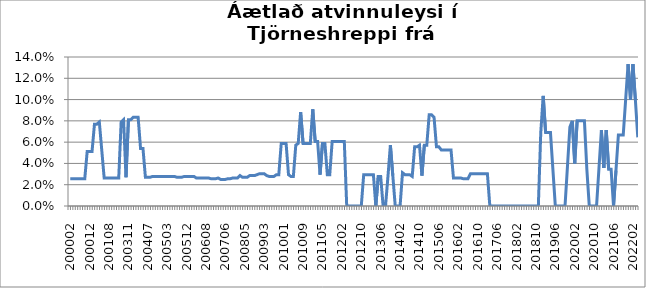
| Category | Series 0 |
|---|---|
| 200002 | 0.026 |
| 200003 | 0.026 |
| 200004 | 0.026 |
| 200005 | 0.026 |
| 200008 | 0.026 |
| 200009 | 0.026 |
| 200010 | 0.026 |
| 200011 | 0.051 |
| 200012 | 0.051 |
| 200101 | 0.051 |
| 200102 | 0.077 |
| 200103 | 0.077 |
| 200104 | 0.079 |
| 200105 | 0.053 |
| 200106 | 0.026 |
| 200107 | 0.026 |
| 200108 | 0.026 |
| 200110 | 0.026 |
| 200111 | 0.026 |
| 200201 | 0.026 |
| 200202 | 0.026 |
| 200302 | 0.079 |
| 200303 | 0.081 |
| 200307 | 0.027 |
| 200311 | 0.081 |
| 200312 | 0.081 |
| 200401 | 0.083 |
| 200402 | 0.083 |
| 200403 | 0.083 |
| 200404 | 0.054 |
| 200405 | 0.054 |
| 200406 | 0.027 |
| 200407 | 0.027 |
| 200408 | 0.027 |
| 200409 | 0.028 |
| 200410 | 0.028 |
| 200411 | 0.028 |
| 200412 | 0.028 |
| 200501 | 0.028 |
| 200502 | 0.028 |
| 200503 | 0.028 |
| 200504 | 0.028 |
| 200505 | 0.028 |
| 200506 | 0.028 |
| 200507 | 0.027 |
| 200508 | 0.027 |
| 200509 | 0.027 |
| 200510 | 0.028 |
| 200512 | 0.028 |
| 200601 | 0.028 |
| 200602 | 0.028 |
| 200603 | 0.028 |
| 200604 | 0.026 |
| 200605 | 0.026 |
| 200606 | 0.026 |
| 200607 | 0.026 |
| 200608 | 0.026 |
| 200609 | 0.026 |
| 200610 | 0.026 |
| 200611 | 0.026 |
| 200612 | 0.026 |
| 200703 | 0.026 |
| 200704 | 0.025 |
| 200705 | 0.025 |
| 200706 | 0.025 |
| 200707 | 0.026 |
| 200709 | 0.026 |
| 200710 | 0.026 |
| 200711 | 0.026 |
| 200801 | 0.026 |
| 200803 | 0.029 |
| 200804 | 0.027 |
| 200805 | 0.027 |
| 200806 | 0.027 |
| 200807 | 0.029 |
| 200808 | 0.029 |
| 200809 | 0.029 |
| 200810 | 0.029 |
| 200901 | 0.03 |
| 200902 | 0.03 |
| 200903 | 0.03 |
| 200905 | 0.029 |
| 200907 | 0.028 |
| 200908 | 0.028 |
| 200909 | 0.028 |
| 200910 | 0.029 |
| 200911 | 0.029 |
| 200912 | 0.059 |
| 201001 | 0.059 |
| 201002 | 0.059 |
| 201003 | 0.029 |
| 201004 | 0.028 |
| 201005 | 0.028 |
| 201006 | 0.057 |
| 201007 | 0.059 |
| 201008 | 0.088 |
| 201009 | 0.059 |
| 201010 | 0.059 |
| 201011 | 0.059 |
| 201012 | 0.059 |
| 201101 | 0.091 |
| 201102 | 0.061 |
| 201103 | 0.061 |
| 201104 | 0.029 |
| 201105 | 0.059 |
| 201106 | 0.059 |
| 201107 | 0.029 |
| 201108 | 0.029 |
| 201110 | 0.061 |
| 201111 | 0.061 |
| 201112 | 0.061 |
| 201201 | 0.061 |
| 201202 | 0.061 |
| 201203 | 0.061 |
| 201204 | 0 |
| 201205 | 0 |
| 201206 | 0 |
| 201207 | 0 |
| 201208 | 0 |
| 201209 | 0 |
| 201210 | 0 |
| 201211 | 0.029 |
| 201212 | 0.029 |
| 201301 | 0.029 |
| 201302 | 0.029 |
| 201303 | 0.029 |
| 201304 | 0 |
| 201305 | 0.028 |
| 201306 | 0.028 |
| 201307 | 0 |
| 201308 | 0 |
| 201309 | 0.028 |
| 201310 | 0.057 |
| 201311 | 0.029 |
| 201312 | 0 |
| 201401 | 0 |
| 201402 | 0 |
| 201403 | 0.031 |
| 201404 | 0.029 |
| 201405 | 0.029 |
| 201406 | 0.029 |
| 201407 | 0.028 |
| 201408 | 0.056 |
| 201409 | 0.056 |
| 201410 | 0.057 |
| 201411 | 0.029 |
| 201412 | 0.057 |
| 201501 | 0.057 |
| 201502 | 0.086 |
| 201503 | 0.086 |
| 201504 | 0.083 |
| 201505 | 0.056 |
| 201506 | 0.056 |
| 201507 | 0.053 |
| 201508 | 0.053 |
| 201509 | 0.053 |
| 201510 | 0.053 |
| 201511 | 0.053 |
| 201512 | 0.026 |
| 201601 | 0.026 |
| 201602 | 0.026 |
| 201603 | 0.026 |
| 201604 | 0.026 |
| 201605 | 0.026 |
| 201606 | 0.026 |
| 201607 | 0.03 |
| 201608 | 0.03 |
| 201609 | 0.03 |
| 201610 | 0.03 |
| 201611 | 0.03 |
| 201612 | 0.03 |
| 201701 | 0.03 |
| 201702 | 0.03 |
| 201703 | 0 |
| 201704 | 0 |
| 201705 | 0 |
| 201706 | 0 |
| 201707 | 0 |
| 201708 | 0 |
| 201709 | 0 |
| 201710 | 0 |
| 201711 | 0 |
| 201712 | 0 |
| 201801 | 0 |
| 201802 | 0 |
| 201803 | 0 |
| 201804 | 0 |
| 201805 | 0 |
| 201806 | 0 |
| 201807 | 0 |
| 201808 | 0 |
| 201809 | 0 |
| 201810 | 0 |
| 201811 | 0 |
| 201812 | 0.069 |
| 201901 | 0.103 |
| 201902 | 0.069 |
| 201903 | 0.069 |
| 201904 | 0.069 |
| 201905 | 0.034 |
| 201906 | 0 |
| 201907 | 0 |
| 201908 | 0 |
| 201909 | 0 |
| 201910 | 0 |
| 201911 | 0.037 |
| 201912 | 0.074 |
| 202001 | 0.08 |
| 202002 | 0.04 |
| 202003 | 0.08 |
| 202004 | 0.08 |
| 202005 | 0.08 |
| 202006 | 0.08 |
| 202007 | 0.034 |
| 202008 | 0 |
| 202009 | 0 |
| 202010 | 0 |
| 202011 | 0 |
| 202012 | 0.036 |
| 202101 | 0.071 |
| 202102 | 0.036 |
| 202103 | 0.071 |
| 202104 | 0.034 |
| 202105 | 0.034 |
| 202106 | 0 |
| 202107 | 0.033 |
| 202108 | 0.067 |
| 202109 | 0.067 |
| 202110 | 0.067 |
| 202111 | 0.1 |
| 202111 | 0.133 |
| 202201 | 0.1 |
| 202202 | 0.133 |
| 202203 | 0.1 |
| 202204 | 0.065 |